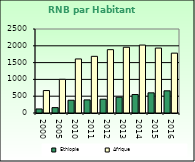
| Category | Ethiopie | Afrique                        |
|---|---|---|
| 2000.0 | 120 | 668.557 |
| 2005.0 | 160 | 1002.896 |
| 2010.0 | 380 | 1608.999 |
| 2011.0 | 390 | 1686.521 |
| 2012.0 | 410 | 1885.129 |
| 2013.0 | 470 | 1956.671 |
| 2014.0 | 550 | 2022.289 |
| 2015.0 | 600 | 1932.283 |
| 2016.0 | 660 | 1781.415 |